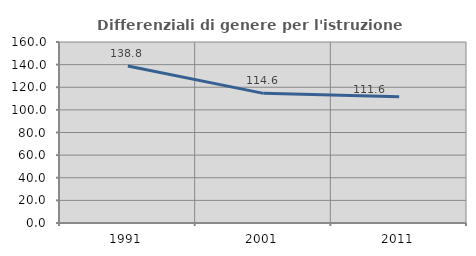
| Category | Differenziali di genere per l'istruzione superiore |
|---|---|
| 1991.0 | 138.768 |
| 2001.0 | 114.609 |
| 2011.0 | 111.573 |